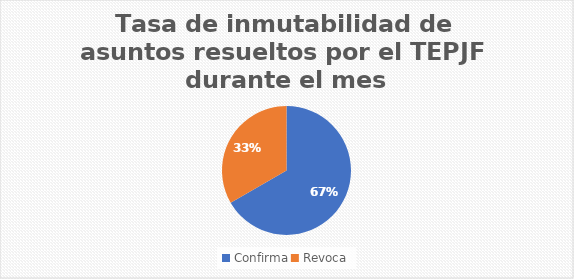
| Category | Tasa de inmutabilidad de asuntos resueltos por el TEPJF durante el mes |
|---|---|
| Confirma | 4 |
| Revoca | 2 |